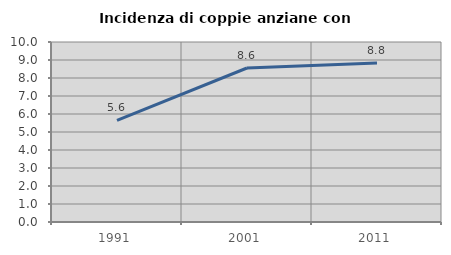
| Category | Incidenza di coppie anziane con figli |
|---|---|
| 1991.0 | 5.641 |
| 2001.0 | 8.556 |
| 2011.0 | 8.84 |